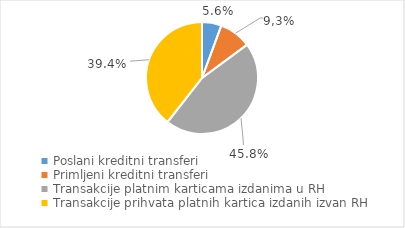
| Category | Series 0 |
|---|---|
| Poslani kreditni transferi | 4133350 |
| Primljeni kreditni transferi | 6792809 |
| Transakcije platnim karticama izdanima u RH | 33622169 |
| Transakcije prihvata platnih kartica izdanih izvan RH | 28987047 |